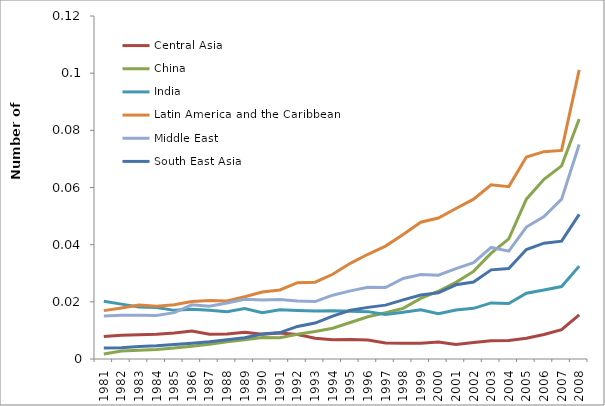
| Category | Central Asia | China | India | Latin America and the Caribbean | Middle East | South East Asia |
|---|---|---|---|---|---|---|
| 1981.0 | 0.008 | 0.002 | 0.02 | 0.017 | 0.015 | 0.004 |
| 1982.0 | 0.008 | 0.003 | 0.019 | 0.018 | 0.015 | 0.004 |
| 1983.0 | 0.008 | 0.003 | 0.018 | 0.019 | 0.015 | 0.004 |
| 1984.0 | 0.009 | 0.003 | 0.018 | 0.018 | 0.015 | 0.005 |
| 1985.0 | 0.009 | 0.004 | 0.017 | 0.019 | 0.016 | 0.005 |
| 1986.0 | 0.01 | 0.004 | 0.017 | 0.02 | 0.019 | 0.005 |
| 1987.0 | 0.009 | 0.005 | 0.017 | 0.02 | 0.018 | 0.006 |
| 1988.0 | 0.009 | 0.006 | 0.017 | 0.02 | 0.02 | 0.007 |
| 1989.0 | 0.009 | 0.007 | 0.018 | 0.022 | 0.021 | 0.007 |
| 1990.0 | 0.009 | 0.008 | 0.016 | 0.023 | 0.021 | 0.009 |
| 1991.0 | 0.009 | 0.007 | 0.017 | 0.024 | 0.021 | 0.009 |
| 1992.0 | 0.009 | 0.009 | 0.017 | 0.027 | 0.02 | 0.011 |
| 1993.0 | 0.007 | 0.01 | 0.017 | 0.027 | 0.02 | 0.013 |
| 1994.0 | 0.007 | 0.011 | 0.017 | 0.03 | 0.022 | 0.015 |
| 1995.0 | 0.007 | 0.013 | 0.017 | 0.033 | 0.024 | 0.017 |
| 1996.0 | 0.007 | 0.015 | 0.017 | 0.037 | 0.025 | 0.018 |
| 1997.0 | 0.006 | 0.016 | 0.016 | 0.039 | 0.025 | 0.019 |
| 1998.0 | 0.006 | 0.018 | 0.016 | 0.044 | 0.028 | 0.021 |
| 1999.0 | 0.006 | 0.021 | 0.017 | 0.048 | 0.03 | 0.022 |
| 2000.0 | 0.006 | 0.024 | 0.016 | 0.049 | 0.029 | 0.023 |
| 2001.0 | 0.005 | 0.027 | 0.017 | 0.053 | 0.032 | 0.026 |
| 2002.0 | 0.006 | 0.031 | 0.018 | 0.056 | 0.034 | 0.027 |
| 2003.0 | 0.006 | 0.037 | 0.02 | 0.061 | 0.039 | 0.031 |
| 2004.0 | 0.007 | 0.042 | 0.019 | 0.06 | 0.038 | 0.032 |
| 2005.0 | 0.007 | 0.056 | 0.023 | 0.071 | 0.046 | 0.038 |
| 2006.0 | 0.009 | 0.063 | 0.024 | 0.073 | 0.05 | 0.041 |
| 2007.0 | 0.01 | 0.068 | 0.025 | 0.073 | 0.056 | 0.041 |
| 2008.0 | 0.015 | 0.084 | 0.032 | 0.101 | 0.075 | 0.051 |